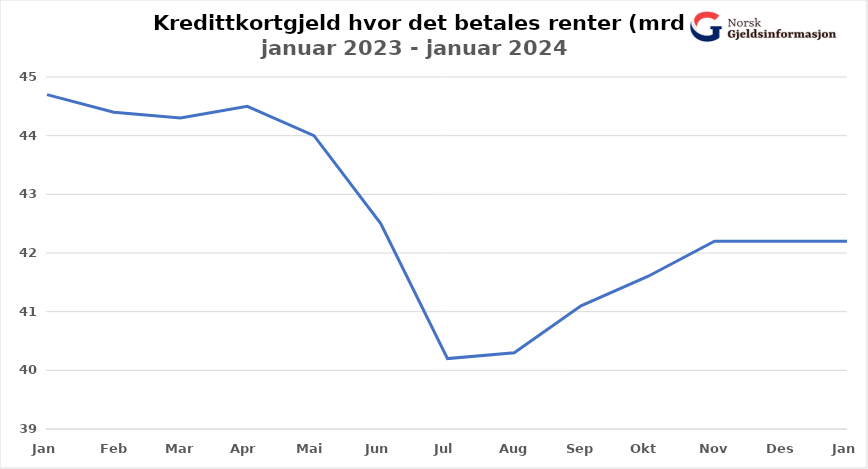
| Category | Rentebærende rammekreditt |
|---|---|
| Jan | 44.7 |
| Feb | 44.4 |
| Mar | 44.3 |
| Apr | 44.5 |
| Mai | 44 |
| Jun | 42.5 |
| Jul | 40.2 |
| Aug | 40.3 |
| Sep | 41.1 |
| Okt | 41.6 |
| Nov | 42.2 |
| Des | 42.2 |
| Jan | 42.2 |